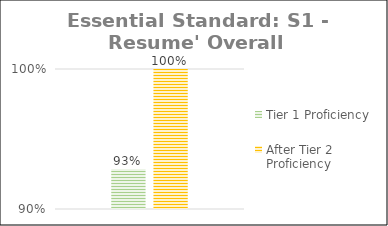
| Category | Tier 1 Proficiency | After Tier 2 Proficiency |
|---|---|---|
| 0 | 0.929 | 1 |